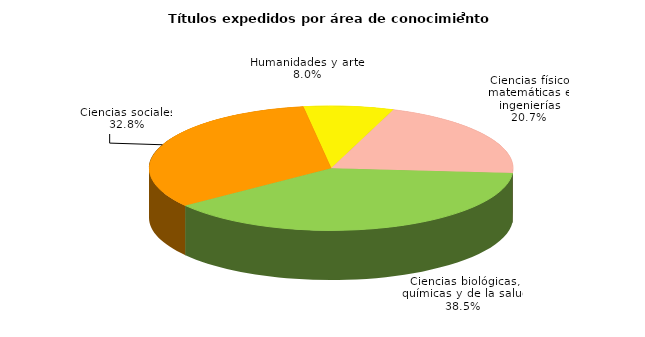
| Category | Series 0 |
|---|---|
| Ciencias físico matemáticas e ingenierías | 4835 |
| Ciencias biológicas, químicas y de la salud | 9009 |
| Ciencias sociales | 7672 |
| Humanidades y artes | 1872 |